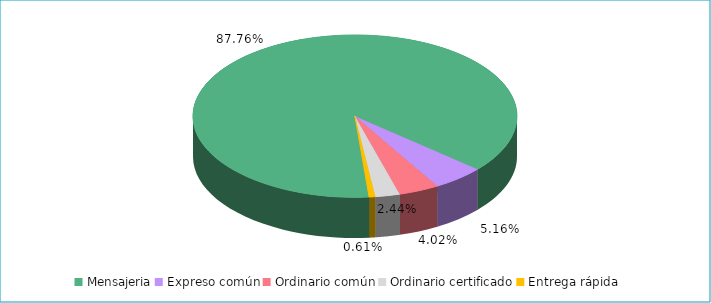
| Category | Series 0 |
|---|---|
| Mensajeria | 0.878 |
| Expreso común | 0.052 |
| Ordinario común | 0.04 |
| Ordinario certificado | 0.024 |
| Entrega rápida | 0.006 |